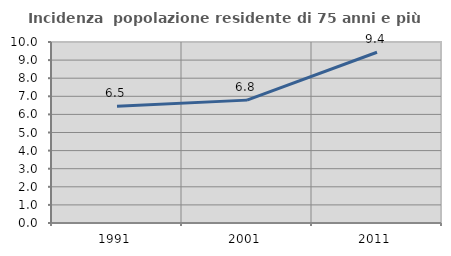
| Category | Incidenza  popolazione residente di 75 anni e più |
|---|---|
| 1991.0 | 6.454 |
| 2001.0 | 6.789 |
| 2011.0 | 9.435 |